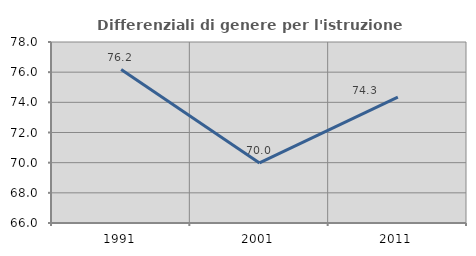
| Category | Differenziali di genere per l'istruzione superiore |
|---|---|
| 1991.0 | 76.175 |
| 2001.0 | 69.983 |
| 2011.0 | 74.341 |